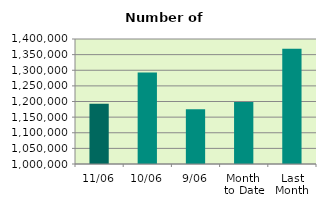
| Category | Series 0 |
|---|---|
| 11/06 | 1192836 |
| 10/06 | 1293198 |
| 9/06 | 1175456 |
| Month 
to Date | 1198385.111 |
| Last
Month | 1368600.286 |